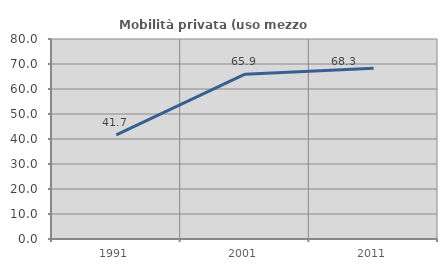
| Category | Mobilità privata (uso mezzo privato) |
|---|---|
| 1991.0 | 41.691 |
| 2001.0 | 65.923 |
| 2011.0 | 68.332 |